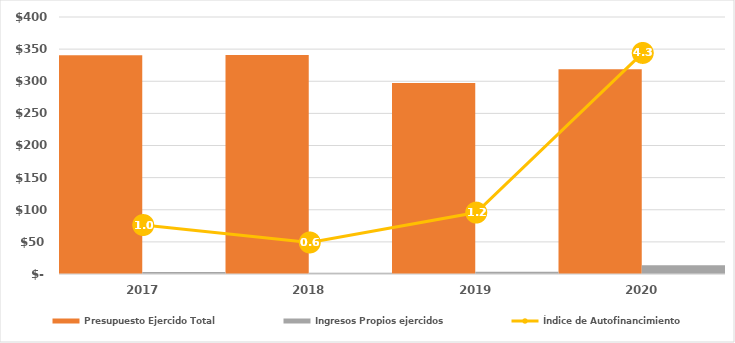
| Category | Presupuesto Ejercido Total | Ingresos Propios ejercidos |
|---|---|---|
| 2017.0 | 340334.7 | 3242.2 |
| 2018.0 | 340765 | 2090 |
| 2019.0 | 297383.7 | 3552.847 |
| 2020.0 | 318785.247 | 13709.89 |